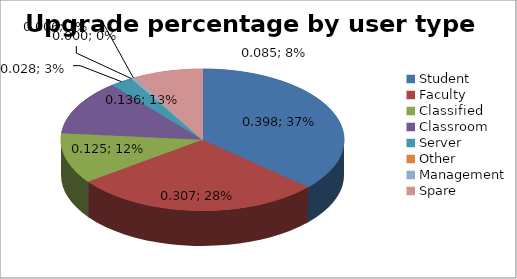
| Category | Series 0 |
|---|---|
| Student | 0.398 |
| Faculty | 0.307 |
| Classified | 0.125 |
| Classroom | 0.136 |
| Server | 0.028 |
| Other | 0 |
| Management | 0.006 |
| Spare | 0.085 |